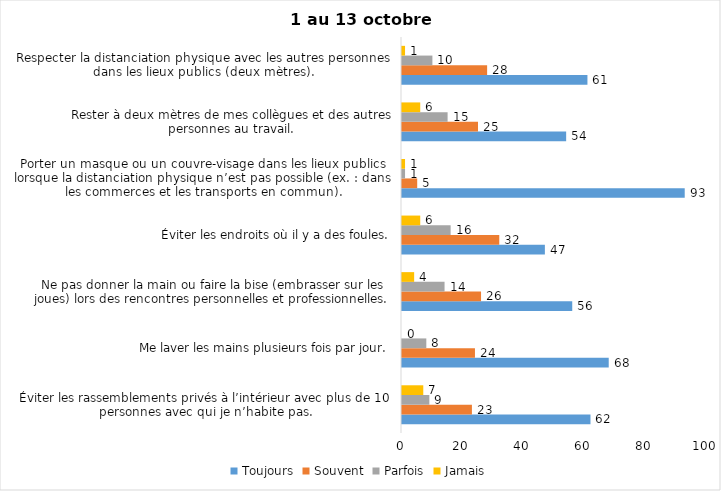
| Category | Toujours | Souvent | Parfois | Jamais |
|---|---|---|---|---|
| Éviter les rassemblements privés à l’intérieur avec plus de 10 personnes avec qui je n’habite pas. | 62 | 23 | 9 | 7 |
| Me laver les mains plusieurs fois par jour. | 68 | 24 | 8 | 0 |
| Ne pas donner la main ou faire la bise (embrasser sur les joues) lors des rencontres personnelles et professionnelles. | 56 | 26 | 14 | 4 |
| Éviter les endroits où il y a des foules. | 47 | 32 | 16 | 6 |
| Porter un masque ou un couvre-visage dans les lieux publics lorsque la distanciation physique n’est pas possible (ex. : dans les commerces et les transports en commun). | 93 | 5 | 1 | 1 |
| Rester à deux mètres de mes collègues et des autres personnes au travail. | 54 | 25 | 15 | 6 |
| Respecter la distanciation physique avec les autres personnes dans les lieux publics (deux mètres). | 61 | 28 | 10 | 1 |